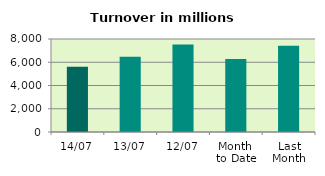
| Category | Series 0 |
|---|---|
| 14/07 | 5608.6 |
| 13/07 | 6480.389 |
| 12/07 | 7526.937 |
| Month 
to Date | 6269.51 |
| Last
Month | 7424.465 |